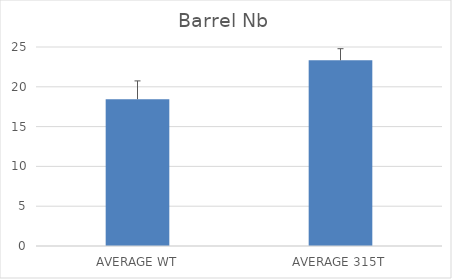
| Category | Series 0 |
|---|---|
| AVERAGE WT | 18.444 |
| AVERAGE 315T | 23.333 |